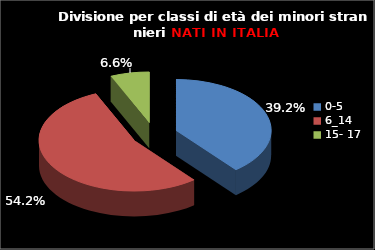
| Category | Series 0 |
|---|---|
| 0-5 | 83 |
| 6_14 | 115 |
| 15- 17 | 14 |